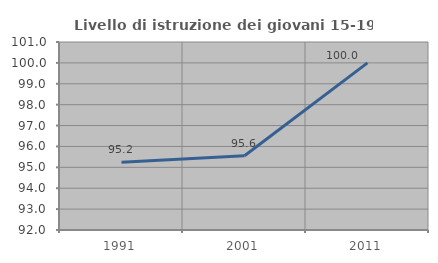
| Category | Livello di istruzione dei giovani 15-19 anni |
|---|---|
| 1991.0 | 95.238 |
| 2001.0 | 95.556 |
| 2011.0 | 100 |